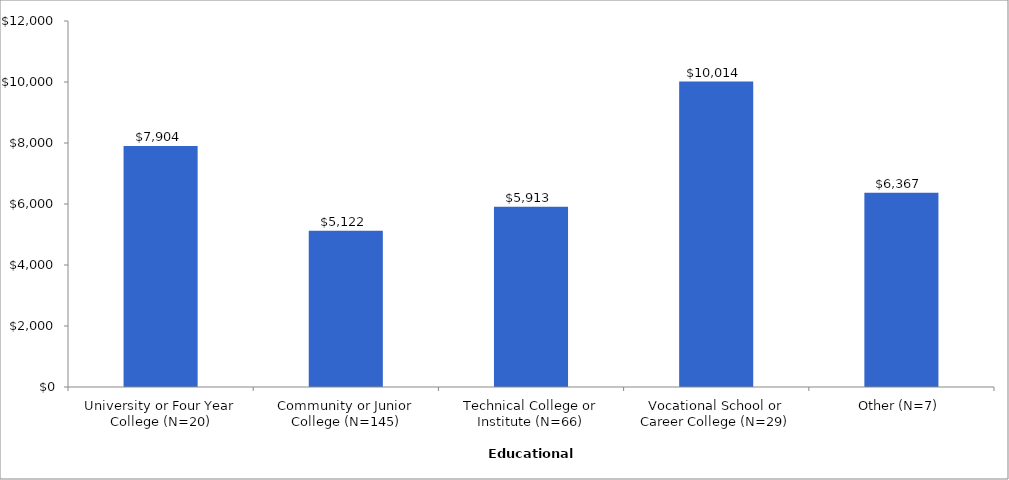
| Category | Series 0 |
|---|---|
| University or Four Year College (N=20) | 7904 |
| Community or Junior College (N=145) | 5122 |
| Technical College or Institute (N=66) | 5913 |
| Vocational School or Career College (N=29) | 10014 |
| Other (N=7) | 6367 |